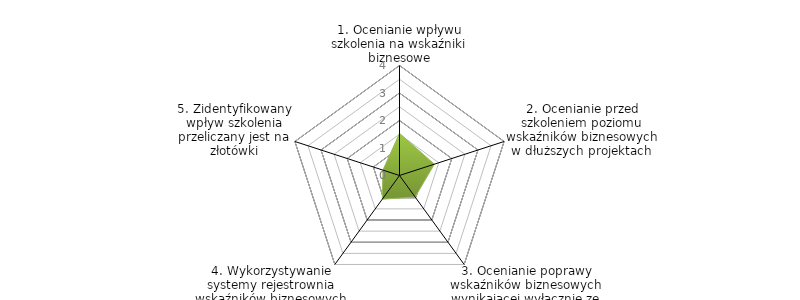
| Category | Series 0 | BENCHMARK |
|---|---|---|
| 1. Ocenianie wpływu szkolenia na wskaźniki biznesowe |  | 1.533 |
| 2. Ocenianie przed szkoleniem poziomu wskaźników biznesowych w dłuższych projektach  |  | 1.333 |
| 3. Ocenianie poprawy wskaźników biznesowych wynikającej wyłącznie ze szkolenia |  | 0.967 |
| 4. Wykorzystywanie systemy rejestrownia wskaźników biznesowych do oceny wpływu szkolenia  |  | 1.067 |
| 5. Zidentyfikowany wpływ szkolenia przeliczany jest na złotówki |  | 0.633 |